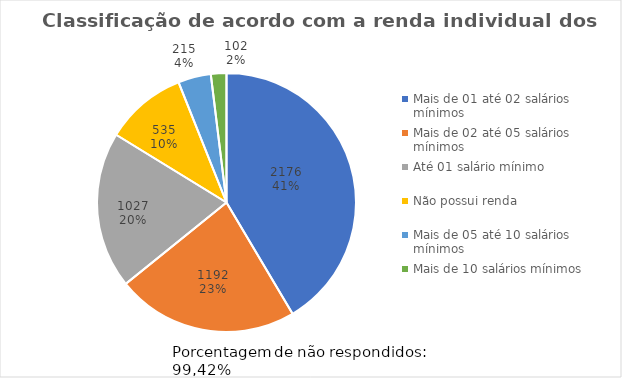
| Category | Series 0 |
|---|---|
| Mais de 01 até 02 salários mínimos  | 2176 |
| Mais de 02 até 05 salários mínimos  | 1192 |
| Até 01 salário mínimo               | 1027 |
| Não possui renda                    | 535 |
| Mais de 05 até 10 salários mínimos  | 215 |
| Mais de 10 salários mínimos         | 102 |